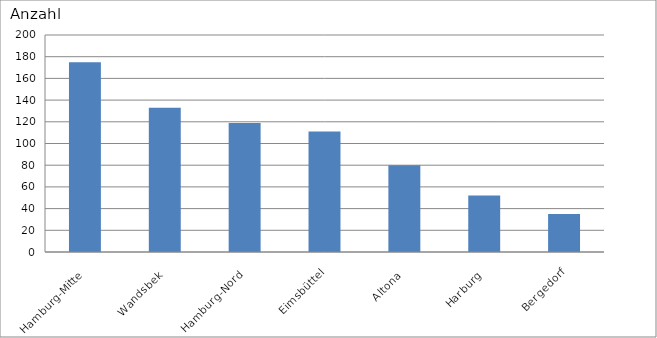
| Category | Hamburg-Mitte Wandsbek Hamburg-Nord Eimsbüttel Altona Harburg Bergedorf |
|---|---|
| Hamburg-Mitte | 175 |
| Wandsbek | 133 |
| Hamburg-Nord | 119 |
| Eimsbüttel | 111 |
| Altona | 80 |
| Harburg | 52 |
| Bergedorf | 35 |